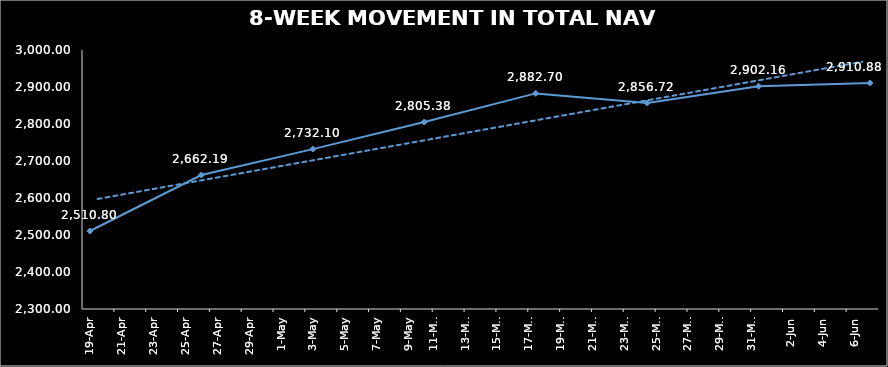
| Category | TOTAL NAV |
|---|---|
| 2024-04-19 | 2510.798 |
| 2024-04-26 | 2662.194 |
| 2024-05-03 | 2732.096 |
| 2024-05-10 | 2805.38 |
| 2024-05-17 | 2882.698 |
| 2024-05-24 | 2856.718 |
| 2024-05-31 | 2902.16 |
| 2024-06-07 | 2910.878 |